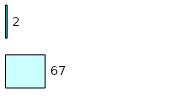
| Category | Series 0 | Series 1 |
|---|---|---|
| 0 | 67 | 2 |